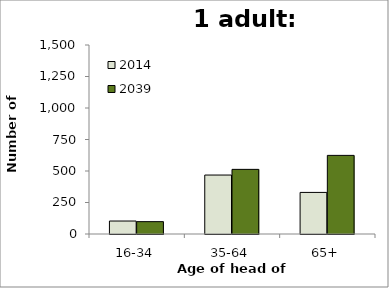
| Category | 2014 | 2039 |
|---|---|---|
| 16-34 | 103 | 98 |
| 35-64 | 468 | 513 |
| 65+ | 330 | 624 |